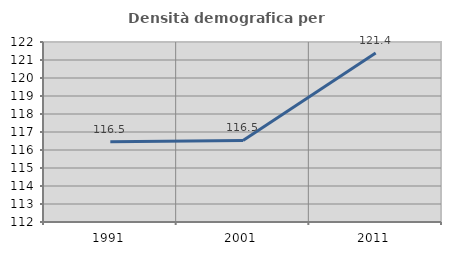
| Category | Densità demografica |
|---|---|
| 1991.0 | 116.465 |
| 2001.0 | 116.534 |
| 2011.0 | 121.396 |